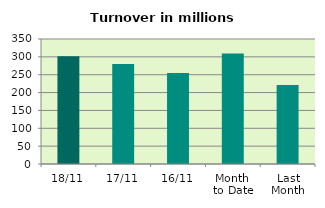
| Category | Series 0 |
|---|---|
| 18/11 | 301.9 |
| 17/11 | 279.981 |
| 16/11 | 254.523 |
| Month 
to Date | 309.345 |
| Last
Month | 221.516 |